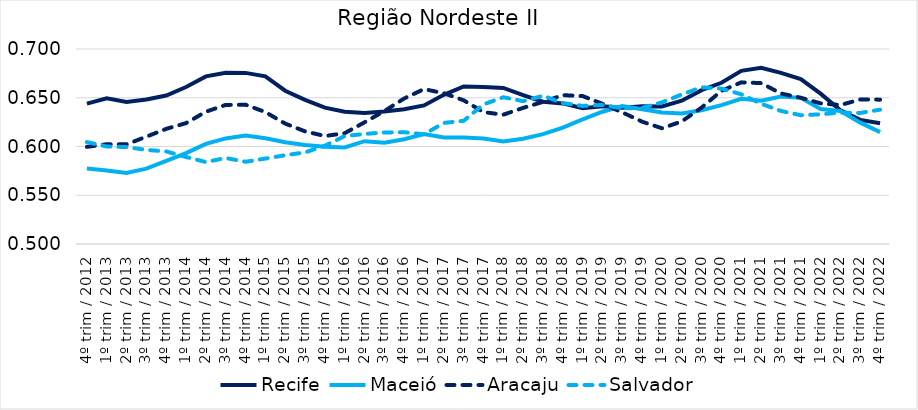
| Category | Recife | Maceió | Aracaju | Salvador |
|---|---|---|---|---|
| 4º trim / 2012 | 0.644 | 0.578 | 0.6 | 0.605 |
| 1º trim / 2013 | 0.649 | 0.575 | 0.602 | 0.6 |
| 2º trim / 2013 | 0.646 | 0.573 | 0.602 | 0.599 |
| 3º trim / 2013 | 0.648 | 0.577 | 0.61 | 0.597 |
| 4º trim / 2013 | 0.652 | 0.585 | 0.618 | 0.595 |
| 1º trim / 2014 | 0.661 | 0.593 | 0.624 | 0.589 |
| 2º trim / 2014 | 0.672 | 0.603 | 0.636 | 0.584 |
| 3º trim / 2014 | 0.676 | 0.608 | 0.643 | 0.588 |
| 4º trim / 2014 | 0.676 | 0.611 | 0.643 | 0.584 |
| 1º trim / 2015 | 0.672 | 0.608 | 0.635 | 0.588 |
| 2º trim / 2015 | 0.657 | 0.604 | 0.624 | 0.591 |
| 3º trim / 2015 | 0.648 | 0.602 | 0.616 | 0.594 |
| 4º trim / 2015 | 0.64 | 0.6 | 0.611 | 0.601 |
| 1º trim / 2016 | 0.636 | 0.599 | 0.614 | 0.611 |
| 2º trim / 2016 | 0.634 | 0.605 | 0.625 | 0.613 |
| 3º trim / 2016 | 0.636 | 0.604 | 0.636 | 0.614 |
| 4º trim / 2016 | 0.638 | 0.607 | 0.649 | 0.615 |
| 1º trim / 2017 | 0.642 | 0.613 | 0.659 | 0.612 |
| 2º trim / 2017 | 0.653 | 0.609 | 0.655 | 0.624 |
| 3º trim / 2017 | 0.662 | 0.609 | 0.647 | 0.626 |
| 4º trim / 2017 | 0.661 | 0.608 | 0.635 | 0.643 |
| 1º trim / 2018 | 0.66 | 0.605 | 0.633 | 0.651 |
| 2º trim / 2018 | 0.653 | 0.608 | 0.64 | 0.646 |
| 3º trim / 2018 | 0.646 | 0.613 | 0.646 | 0.652 |
| 4º trim / 2018 | 0.644 | 0.619 | 0.653 | 0.645 |
| 1º trim / 2019 | 0.639 | 0.628 | 0.652 | 0.642 |
| 2º trim / 2019 | 0.641 | 0.636 | 0.644 | 0.643 |
| 3º trim / 2019 | 0.64 | 0.641 | 0.635 | 0.639 |
| 4º trim / 2019 | 0.641 | 0.638 | 0.625 | 0.64 |
| 1º trim / 2020 | 0.641 | 0.635 | 0.619 | 0.645 |
| 2º trim / 2020 | 0.647 | 0.634 | 0.626 | 0.653 |
| 3º trim / 2020 | 0.658 | 0.637 | 0.64 | 0.661 |
| 4º trim / 2020 | 0.665 | 0.642 | 0.657 | 0.659 |
| 1º trim / 2021 | 0.678 | 0.649 | 0.666 | 0.654 |
| 2º trim / 2021 | 0.681 | 0.647 | 0.665 | 0.644 |
| 3º trim / 2021 | 0.676 | 0.651 | 0.654 | 0.636 |
| 4º trim / 2021 | 0.669 | 0.65 | 0.65 | 0.632 |
| 1º trim / 2022 | 0.654 | 0.638 | 0.644 | 0.633 |
| 2º trim / 2022 | 0.637 | 0.636 | 0.643 | 0.635 |
| 3º trim / 2022 | 0.627 | 0.624 | 0.648 | 0.634 |
| 4º trim / 2022 | 0.624 | 0.615 | 0.648 | 0.638 |